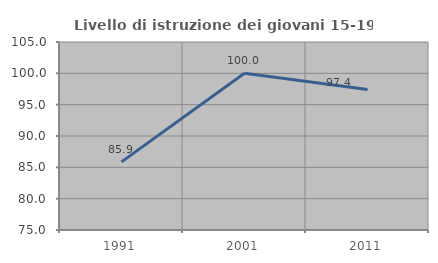
| Category | Livello di istruzione dei giovani 15-19 anni |
|---|---|
| 1991.0 | 85.87 |
| 2001.0 | 100 |
| 2011.0 | 97.436 |